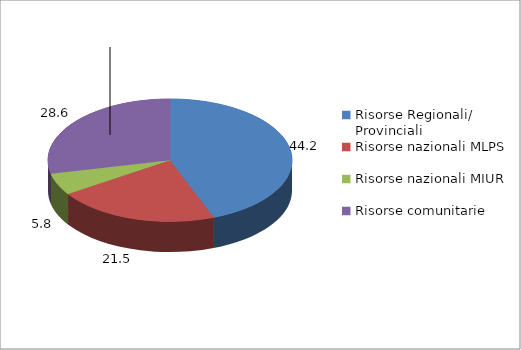
| Category | Series 0 |
|---|---|
| Risorse Regionali/ Provinciali | 44.205 |
| Risorse nazionali MLPS | 21.505 |
| Risorse nazionali MIUR | 5.769 |
| Risorse comunitarie | 28.572 |